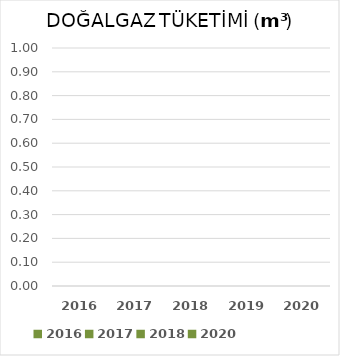
| Category | DOĞALGAZ (m³) |
|---|---|
| 2016.0 | 0 |
| 2017.0 | 0 |
| 2018.0 | 0 |
| 2019.0 | 0 |
| 2020.0 | 0 |